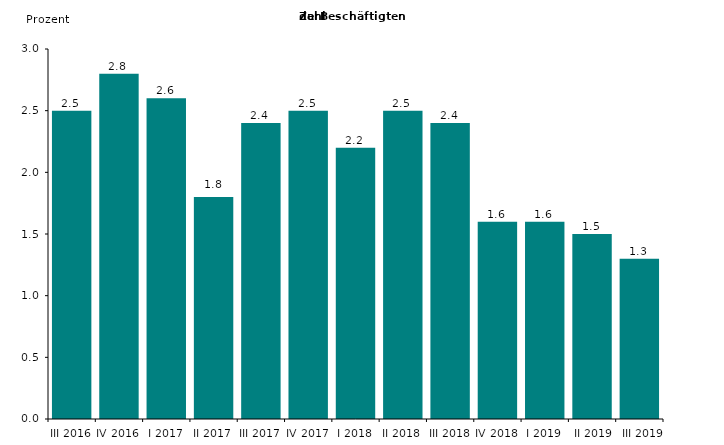
| Category | Series 0 |
|---|---|
| III 2016 | 2.5 |
| IV 2016 | 2.8 |
| I 2017 | 2.6 |
| II 2017 | 1.8 |
| III 2017 | 2.4 |
| IV 2017 | 2.5 |
| I 2018 | 2.2 |
| II 2018 | 2.5 |
| III 2018 | 2.4 |
| IV 2018 | 1.6 |
| I 2019 | 1.6 |
|  II 2019 | 1.5 |
|  III 2019 | 1.3 |